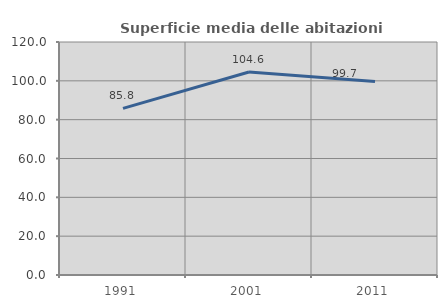
| Category | Superficie media delle abitazioni occupate |
|---|---|
| 1991.0 | 85.842 |
| 2001.0 | 104.552 |
| 2011.0 | 99.676 |